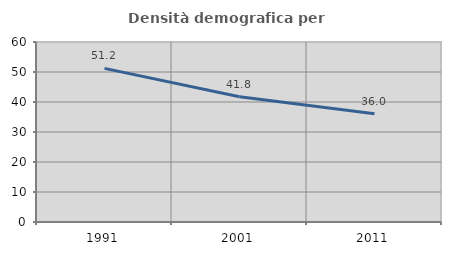
| Category | Densità demografica |
|---|---|
| 1991.0 | 51.207 |
| 2001.0 | 41.777 |
| 2011.0 | 36.048 |